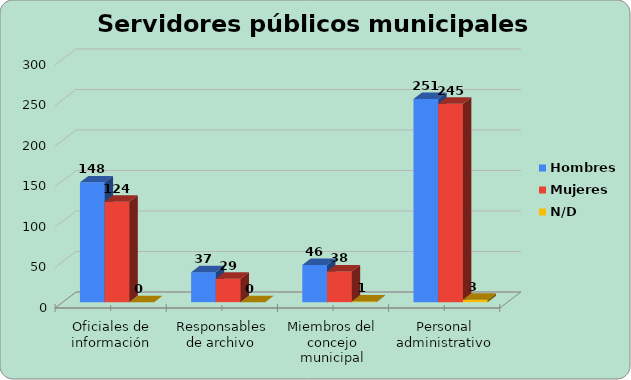
| Category | Hombres | Mujeres | N/D |
|---|---|---|---|
| Oficiales de información | 148 | 124 | 0 |
| Responsables de archivo | 37 | 29 | 0 |
| Miembros del concejo municipal | 46 | 38 | 1 |
| Personal administrativo | 251 | 245 | 3 |